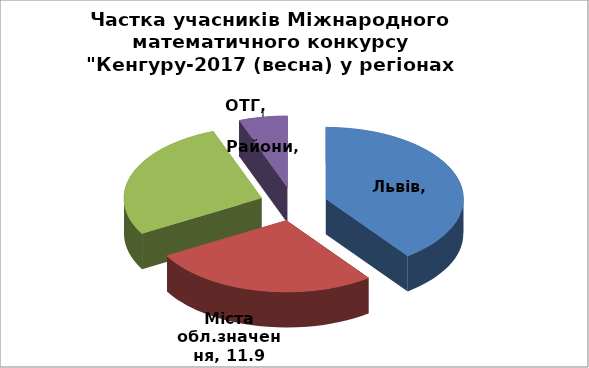
| Category | Р |
|---|---|
| Львів | 17.642 |
| Міста обл.значення | 11.917 |
| Райони | 12.194 |
| ОТГ | 2.532 |